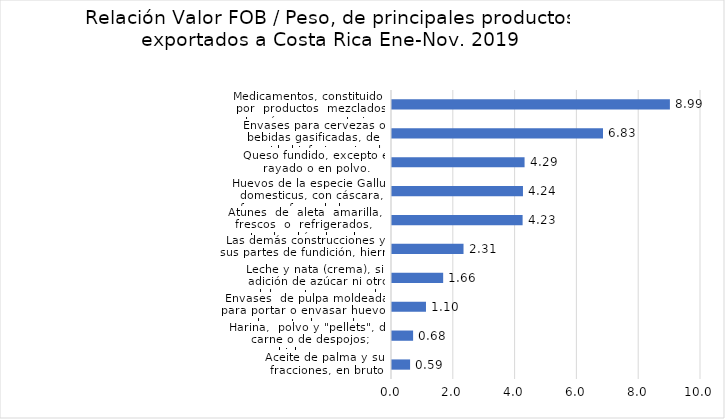
| Category | Series 0 |
|---|---|
| Aceite de palma y sus fracciones, en bruto | 0.585 |
| Harina,  polvo y "pellets", de carne o de despojos; chicharrones | 0.683 |
| Envases  de pulpa moldeada para portar o envasar huevos, de pasta de papel | 1.1 |
| Leche y nata (crema), sin adición de azúcar ni otro edulcorante, evaporadas | 1.656 |
| Las demás construcciones y sus partes de fundición, hierro o acero | 2.315 |
| Atunes  de  aleta  amarilla, frescos  o  refrigerados,  excepto   los  hígados,  huevas  y lechas | 4.227 |
| Huevos de la especie Gallus domesticus, con cáscara, frescos, fecundados para incubación. | 4.238 |
| Queso fundido, excepto el rayado o en polvo. | 4.29 |
| Envases para cervezas o bebidas gasificadas, de capacidad inferior o igual a 300 l, de aluminio. | 6.829 |
| Medicamentos, constituido  por  productos  mezclados entre sí para uso veterinario | 8.993 |